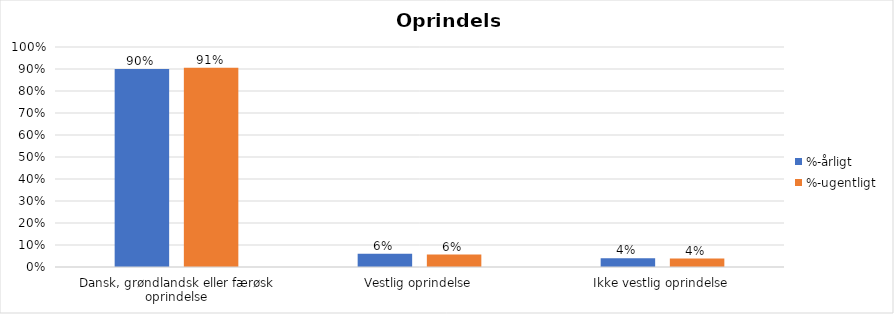
| Category | %-årligt | %-ugentligt |
|---|---|---|
| Dansk, grøndlandsk eller færøsk oprindelse | 0.9 | 0.905 |
| Vestlig oprindelse | 0.06 | 0.057 |
| Ikke vestlig oprindelse | 0.04 | 0.038 |